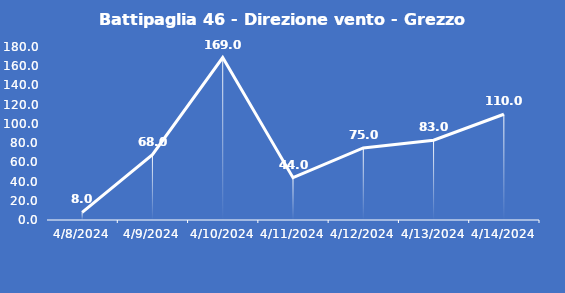
| Category | Battipaglia 46 - Direzione vento - Grezzo (°N) |
|---|---|
| 4/8/24 | 8 |
| 4/9/24 | 68 |
| 4/10/24 | 169 |
| 4/11/24 | 44 |
| 4/12/24 | 75 |
| 4/13/24 | 83 |
| 4/14/24 | 110 |